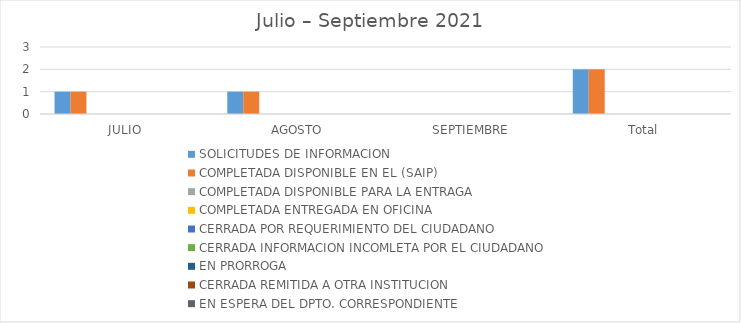
| Category | SOLICITUDES DE INFORMACION | COMPLETADA DISPONIBLE EN EL (SAIP) | COMPLETADA DISPONIBLE PARA LA ENTRAGA | COMPLETADA ENTREGADA EN OFICINA | CERRADA POR REQUERIMIENTO DEL CIUDADANO | CERRADA INFORMACION INCOMLETA POR EL CIUDADANO | EN PRORROGA | CERRADA REMITIDA A OTRA INSTITUCION | EN ESPERA DEL DPTO. CORRESPONDIENTE |
|---|---|---|---|---|---|---|---|---|---|
| JULIO | 1 | 1 | 0 | 0 | 0 | 0 | 0 | 0 | 0 |
| AGOSTO | 1 | 1 | 0 | 0 | 0 | 0 | 0 | 0 | 0 |
| SEPTIEMBRE | 0 | 0 | 0 | 0 | 0 | 0 | 0 | 0 | 0 |
| Total | 2 | 2 | 0 | 0 | 0 | 0 | 0 | 0 | 0 |